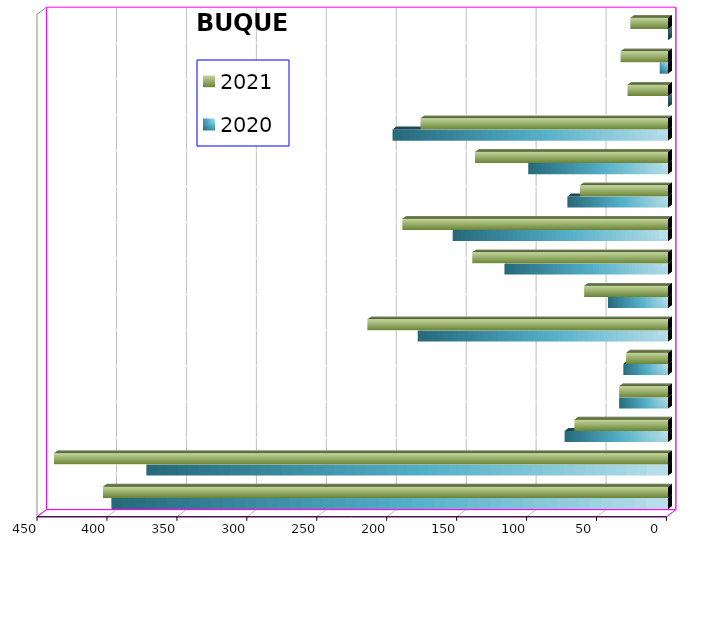
| Category | 2020 | 2021 |
|---|---|---|
| ICAVE | 398 | 404 |
| CICE | 373 | 439 |
| T. C. E. | 74 | 67 |
| CARGILL | 35 | 35 |
| TMV | 32 | 30 |
| SSA | 179 | 215 |
| SEPSA | 43 | 60 |
| VOPAK | 117 | 140 |
| CPV | 154 | 190 |
| EXCELLENCE | 72 | 63 |
| SIPPB | 100 | 138 |
| PEMEX | 197 | 177 |
| PETRA | 0 | 29 |
| OPEVER | 6 | 34 |
| ESJ ERNOVABLE III | 0 | 27 |